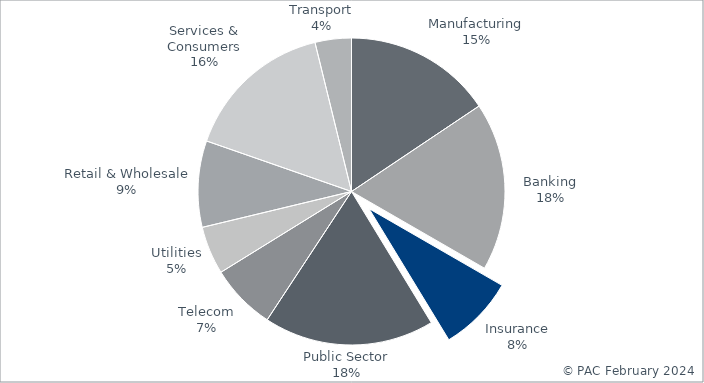
| Category | Series 0 |
|---|---|
| Manufacturing | 19859.661 |
| Banking | 22557.353 |
| Insurance | 10150.659 |
| Public Sector | 22849.876 |
| Telecom | 8822.503 |
| Utilities | 6440.119 |
| Retail & Wholesale | 11572.425 |
| Services & Consumers | 20155.425 |
| Transport | 4871.019 |